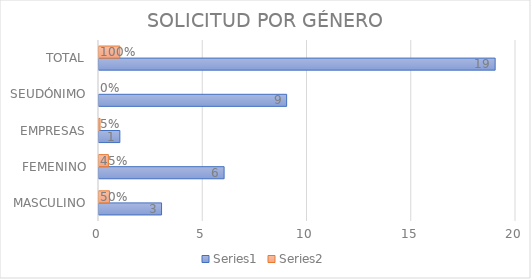
| Category | Series 0 | Series 1 |
|---|---|---|
| MASCULINO | 3 | 0.5 |
| FEMENINO | 6 | 0.45 |
| EMPRESAS | 1 | 0.05 |
| SEUDÓNIMO | 9 | 0 |
| TOTAL | 19 | 1 |